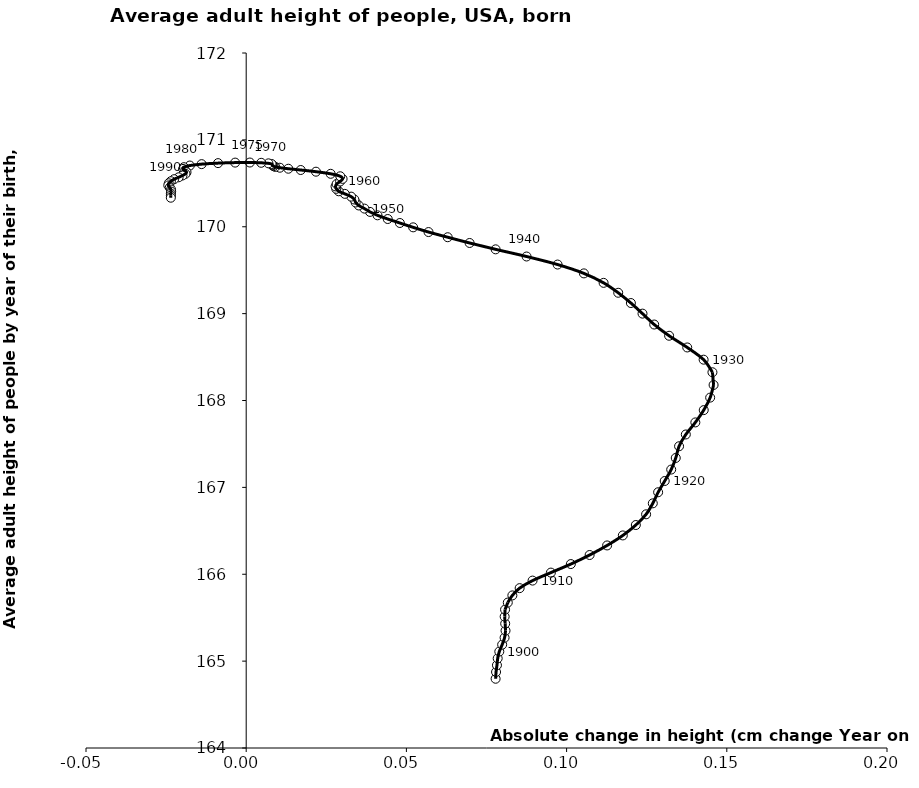
| Category | Series 0 |
|---|---|
| 0.07784594999998262 | 164.797 |
| 0.07798329999998543 | 164.875 |
| 0.07826314999999795 | 164.953 |
| 0.07849275000000944 | 165.031 |
| 0.07899740000000577 | 165.11 |
| 0.0798876249999978 | 165.189 |
| 0.08064389999999833 | 165.27 |
| 0.08093829999999969 | 165.351 |
| 0.0808342249999896 | 165.432 |
| 0.08066667500000335 | 165.512 |
| 0.08079485000001796 | 165.593 |
| 0.08164382499998624 | 165.674 |
| 0.08307187499998747 | 165.756 |
| 0.08534592500001281 | 165.84 |
| 0.08937712500001282 | 165.927 |
| 0.0950957499999987 | 166.019 |
| 0.10132377499999734 | 166.117 |
| 0.10718759999998895 | 166.222 |
| 0.112643300000002 | 166.332 |
| 0.11754517500000361 | 166.447 |
| 0.1216067749999894 | 166.567 |
| 0.12481470000000172 | 166.69 |
| 0.1269039250000077 | 166.816 |
| 0.12856684999999857 | 166.944 |
| 0.13062254999999823 | 167.073 |
| 0.13264580000000592 | 167.205 |
| 0.13407075000000646 | 167.339 |
| 0.13510354999999663 | 167.473 |
| 0.13721087499999385 | 167.609 |
| 0.14018392500000232 | 167.748 |
| 0.14280137500000478 | 167.889 |
| 0.1448069500000031 | 168.033 |
| 0.14587662499999965 | 168.179 |
| 0.1455200750000074 | 168.325 |
| 0.14276629999999102 | 168.47 |
| 0.13765122499998483 | 168.611 |
| 0.13199265000000082 | 168.745 |
| 0.12734205000000998 | 168.875 |
| 0.12369094999999675 | 169 |
| 0.12006510000000503 | 169.122 |
| 0.11610862499999541 | 169.24 |
| 0.11154777499999113 | 169.354 |
| 0.10539730000000702 | 169.463 |
| 0.0971875250000096 | 169.565 |
| 0.08750722500001018 | 169.658 |
| 0.07784722499998509 | 169.74 |
| 0.06972582499999191 | 169.813 |
| 0.06289329999999893 | 169.879 |
| 0.056905499999999165 | 169.939 |
| 0.05210712500000625 | 169.993 |
| 0.04795934999999929 | 170.043 |
| 0.044177575000006186 | 170.089 |
| 0.04097899999999299 | 170.132 |
| 0.038634299999998234 | 170.171 |
| 0.03691080000001534 | 170.209 |
| 0.03513342499998373 | 170.245 |
| 0.03416457499999126 | 170.279 |
| 0.03376402500001063 | 170.313 |
| 0.03275484999998923 | 170.347 |
| 0.030780300000003535 | 170.379 |
| 0.02887530000000993 | 170.408 |
| 0.028116600000004155 | 170.437 |
| 0.027884600000007254 | 170.464 |
| 0.028227974999992966 | 170.492 |
| 0.0293033749999978 | 170.521 |
| 0.030083000000004745 | 170.551 |
| 0.029351574999992636 | 170.581 |
| 0.02636227499998256 | 170.61 |
| 0.021777124999999842 | 170.634 |
| 0.01702010000001053 | 170.653 |
| 0.01315485000000649 | 170.668 |
| 0.010496475000010719 | 170.679 |
| 0.00908727499999884 | 170.689 |
| 0.008563675000004878 | 170.698 |
| 0.008225975000001995 | 170.706 |
| 0.008121949999988942 | 170.714 |
| 0.007923649999995064 | 170.722 |
| 0.00694767500000637 | 170.73 |
| 0.004680574999994747 | 170.736 |
| 0.0011459999999914317 | 170.739 |
| -0.0034508999999900425 | 170.738 |
| -0.008785099999997215 | 170.732 |
| -0.01390807500000335 | 170.721 |
| -0.017592750000005708 | 170.705 |
| -0.01944930000000511 | 170.686 |
| -0.01970159999999055 | 170.666 |
| -0.019052200000004405 | 170.646 |
| -0.018629750000002332 | 170.628 |
| -0.01895604999998568 | 170.609 |
| -0.01988860000000159 | 170.59 |
| -0.02108880000000113 | 170.569 |
| -0.02249157500000365 | 170.547 |
| -0.023500850000004903 | 170.524 |
| -0.024164650000003007 | 170.5 |
| -0.024321675000010146 | 170.476 |
| -0.023859799999996767 | 170.452 |
| -0.023453124999988972 | 170.428 |
| -0.023424700000006737 | 170.405 |
| -0.023518525000000068 | 170.381 |
| -0.023521774999991862 | 170.358 |
| -0.023525024999983657 | 170.334 |